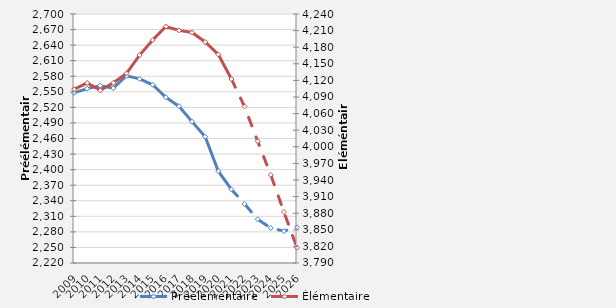
| Category | Préélémentaire |
|---|---|
| 2009.0 | 2547.9 |
| 2010.0 | 2556.1 |
| 2011.0 | 2561.8 |
| 2012.0 | 2557 |
| 2013.0 | 2580.9 |
| 2014.0 | 2574.9 |
| 2015.0 | 2563.6 |
| 2016.0 | 2539.5 |
| 2017.0 | 2522.3 |
| 2018.0 | 2492.5 |
| 2019.0 | 2463.4 |
| 2020.0 | 2396.906 |
| 2021.0 | 2361.91 |
| 2022.0 | 2333.9 |
| 2023.0 | 2304.3 |
| 2024.0 | 2287.4 |
| 2025.0 | 2281.6 |
| 2026.0 | 2288.7 |